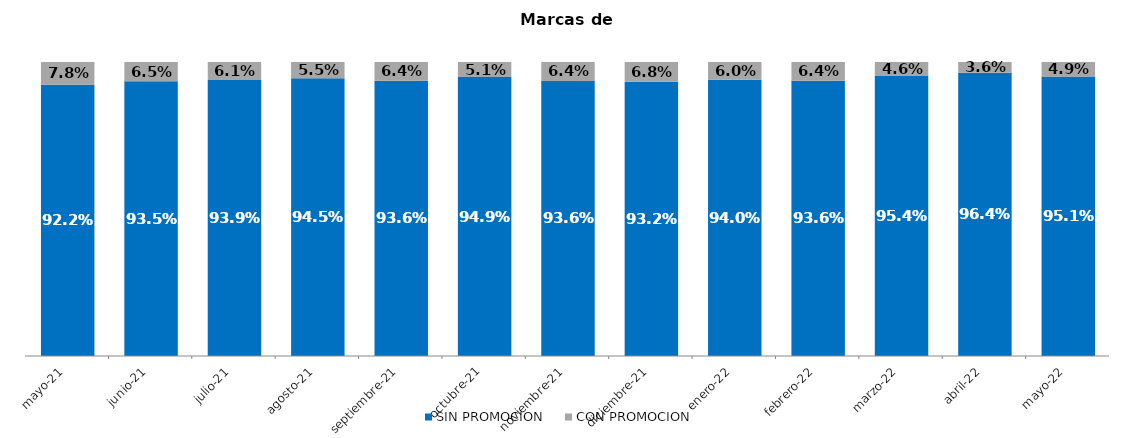
| Category | SIN PROMOCION   | CON PROMOCION   |
|---|---|---|
| 2021-05-01 | 0.922 | 0.078 |
| 2021-06-01 | 0.935 | 0.065 |
| 2021-07-01 | 0.939 | 0.061 |
| 2021-08-01 | 0.945 | 0.055 |
| 2021-09-01 | 0.936 | 0.064 |
| 2021-10-01 | 0.949 | 0.051 |
| 2021-11-01 | 0.936 | 0.064 |
| 2021-12-01 | 0.932 | 0.068 |
| 2022-01-01 | 0.94 | 0.06 |
| 2022-02-01 | 0.936 | 0.064 |
| 2022-03-01 | 0.954 | 0.046 |
| 2022-04-01 | 0.964 | 0.036 |
| 2022-05-01 | 0.951 | 0.049 |